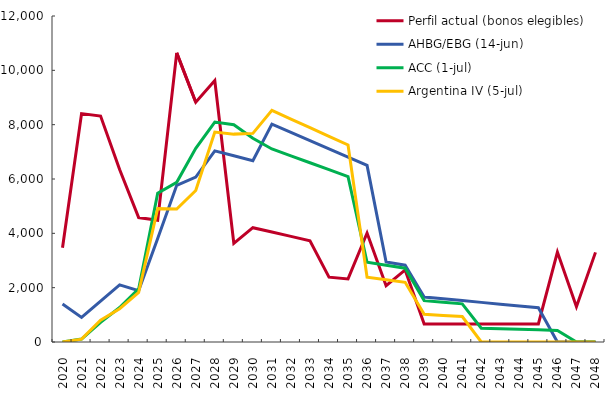
| Category | Perfil actual (bonos elegibles) | AHBG/EBG (14-jun) | ACC (1-jul) | Argentina IV (5-jul) |
|---|---|---|---|---|
| 2020  | 3469.932 | 1396.179 | 0 | 0 |
| 2021  | 8408.68 | 906.715 | 109.474 | 106.033 |
| 2022  | 8318.052 | 1502.017 | 725.177 | 800.218 |
| 2023  | 6350.477 | 2104.014 | 1269.642 | 1226.777 |
| 2024  | 4579.387 | 1892.117 | 1953.628 | 1825.586 |
| 2025  | 4482.705 | 3806.922 | 5480.137 | 4914.982 |
| 2026  | 10641.71 | 5769.325 | 5876.925 | 4897.006 |
| 2027  | 8828.237 | 6068.938 | 7131.01 | 5575.612 |
| 2028  | 9626.221 | 7035.795 | 8096.853 | 7727.596 |
| 2029  | 3627.899 | 6853.062 | 7999.881 | 7651.94 |
| 2030  | 4207.605 | 6670.329 | 7501.683 | 7679.215 |
| 2031  | 4047.883 | 8018.315 | 7105.091 | 8525.416 |
| 2032  | 3888.306 | 7716.688 | 6851.367 | 8207.654 |
| 2033  | 3728.44 | 7415.06 | 6597.642 | 7889.892 |
| 2034  | 2386.661 | 7112.608 | 6343.918 | 7572.131 |
| 2035  | 2323.83 | 6807.683 | 6090.194 | 7254.369 |
| 2036  | 4011.144 | 6502.757 | 2937.03 | 2383.154 |
| 2037  | 2073.481 | 2946.298 | 2826.936 | 2290.567 |
| 2038  | 2652.259 | 2826.688 | 2716.842 | 2197.98 |
| 2039  | 664.603 | 1654.785 | 1522.73 | 1021.376 |
| 2040  | 664.747 | 1589.343 | 1463.037 | 979.19 |
| 2041  | 664.603 | 1523.901 | 1403.344 | 937.003 |
| 2042  | 664.603 | 1458.458 | 508.487 | 0 |
| 2043  | 664.603 | 1393.016 | 488.168 | 0 |
| 2044  | 664.747 | 1327.574 | 467.848 | 0 |
| 2045  | 664.603 | 1262.132 | 447.529 | 0 |
| 2046  | 3309.759 | 0 | 427.209 | 0 |
| 2047  | 1298.56 | 0 | 0 | 0 |
| 2048  | 3299.062 | 0 | 0 | 0 |